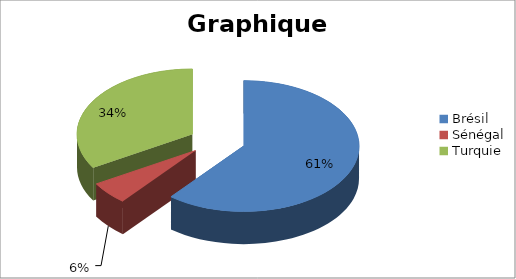
| Category | Series 0 |
|---|---|
| Brésil | 125000000 |
| Sénégal | 11555000 |
| Turquie | 68888822 |